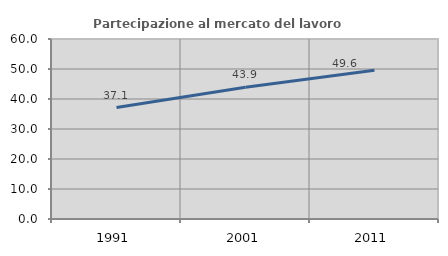
| Category | Partecipazione al mercato del lavoro  femminile |
|---|---|
| 1991.0 | 37.14 |
| 2001.0 | 43.908 |
| 2011.0 | 49.621 |